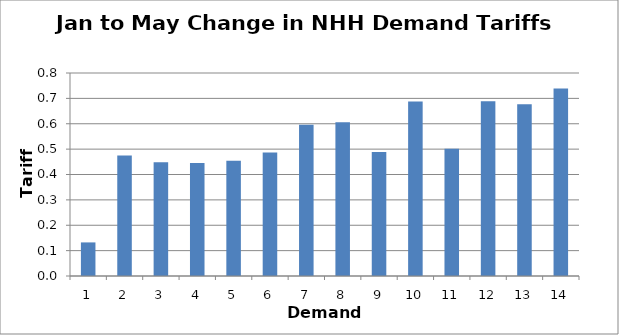
| Category | Change (p/kWh) |
|---|---|
| 0 | 0.132 |
| 1 | 0.475 |
| 2 | 0.448 |
| 3 | 0.445 |
| 4 | 0.454 |
| 5 | 0.487 |
| 6 | 0.596 |
| 7 | 0.606 |
| 8 | 0.489 |
| 9 | 0.688 |
| 10 | 0.501 |
| 11 | 0.688 |
| 12 | 0.677 |
| 13 | 0.739 |